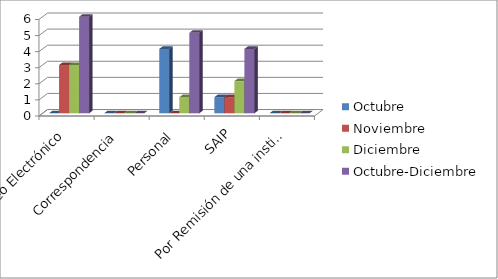
| Category | Octubre | Noviembre | Diciembre | Octubre-Diciembre |
|---|---|---|---|---|
| Correo Electrónico | 0 | 3 | 3 | 6 |
| Correspondencia | 0 | 0 | 0 | 0 |
| Personal | 4 | 0 | 1 | 5 |
| SAIP | 1 | 1 | 2 | 4 |
| Por Remisión de una institución | 0 | 0 | 0 | 0 |